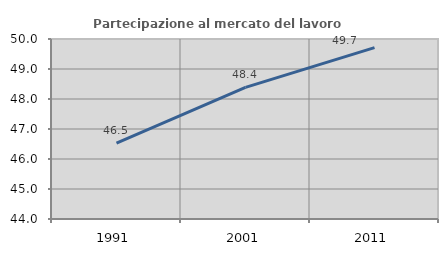
| Category | Partecipazione al mercato del lavoro  femminile |
|---|---|
| 1991.0 | 46.53 |
| 2001.0 | 48.386 |
| 2011.0 | 49.712 |